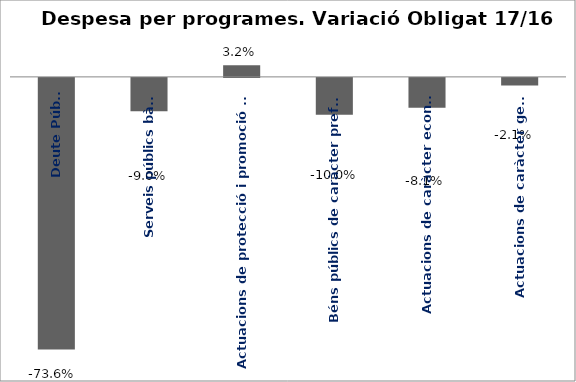
| Category | Series 0 |
|---|---|
| Deute Públic | -0.736 |
| Serveis públics bàsics | -0.09 |
| Actuacions de protecció i promoció social | 0.032 |
| Béns públics de caràcter preferent | -0.1 |
| Actuacions de caràcter econòmic | -0.081 |
| Actuacions de caràcter general | -0.021 |